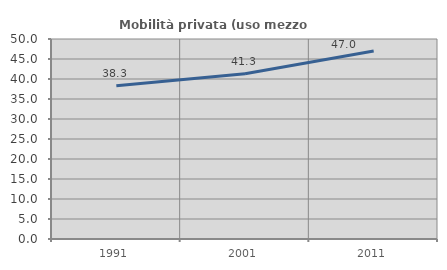
| Category | Mobilità privata (uso mezzo privato) |
|---|---|
| 1991.0 | 38.291 |
| 2001.0 | 41.313 |
| 2011.0 | 46.997 |